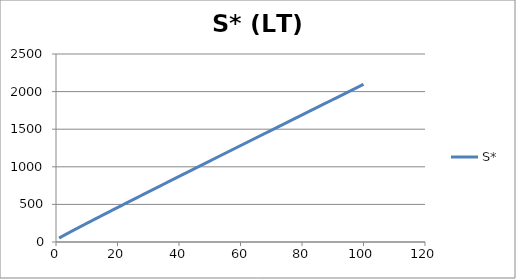
| Category | S* |
|---|---|
| 1.0 | 52.293 |
| 2.0 | 74.986 |
| 3.0 | 97.237 |
| 4.0 | 119.205 |
| 5.0 | 140.972 |
| 6.0 | 162.587 |
| 7.0 | 184.081 |
| 8.0 | 205.477 |
| 9.0 | 226.79 |
| 10.0 | 248.034 |
| 11.0 | 269.216 |
| 12.0 | 290.344 |
| 13.0 | 311.426 |
| 14.0 | 332.465 |
| 15.0 | 353.465 |
| 16.0 | 374.431 |
| 17.0 | 395.366 |
| 18.0 | 416.271 |
| 19.0 | 437.149 |
| 20.0 | 458.003 |
| 21.0 | 478.833 |
| 22.0 | 499.642 |
| 23.0 | 520.431 |
| 24.0 | 541.201 |
| 25.0 | 561.954 |
| 26.0 | 582.689 |
| 27.0 | 603.409 |
| 28.0 | 624.114 |
| 29.0 | 644.804 |
| 30.0 | 665.482 |
| 31.0 | 686.146 |
| 32.0 | 706.798 |
| 33.0 | 727.438 |
| 34.0 | 748.067 |
| 35.0 | 768.686 |
| 36.0 | 789.294 |
| 37.0 | 809.892 |
| 38.0 | 830.481 |
| 39.0 | 851.06 |
| 40.0 | 871.631 |
| 41.0 | 892.194 |
| 42.0 | 912.748 |
| 43.0 | 933.295 |
| 44.0 | 953.833 |
| 45.0 | 974.365 |
| 46.0 | 994.889 |
| 47.0 | 1015.407 |
| 48.0 | 1035.918 |
| 49.0 | 1056.422 |
| 50.0 | 1076.92 |
| 51.0 | 1097.412 |
| 52.0 | 1117.898 |
| 53.0 | 1138.379 |
| 54.0 | 1158.853 |
| 55.0 | 1179.323 |
| 56.0 | 1199.787 |
| 57.0 | 1220.246 |
| 58.0 | 1240.699 |
| 59.0 | 1261.148 |
| 60.0 | 1281.593 |
| 61.0 | 1302.032 |
| 62.0 | 1322.467 |
| 63.0 | 1342.898 |
| 64.0 | 1363.324 |
| 65.0 | 1383.746 |
| 66.0 | 1404.164 |
| 67.0 | 1424.578 |
| 68.0 | 1444.987 |
| 69.0 | 1465.393 |
| 70.0 | 1485.796 |
| 71.0 | 1506.194 |
| 72.0 | 1526.589 |
| 73.0 | 1546.98 |
| 74.0 | 1567.368 |
| 75.0 | 1587.752 |
| 76.0 | 1608.134 |
| 77.0 | 1628.511 |
| 78.0 | 1648.886 |
| 79.0 | 1669.257 |
| 80.0 | 1689.626 |
| 81.0 | 1709.991 |
| 82.0 | 1730.353 |
| 83.0 | 1750.712 |
| 84.0 | 1771.069 |
| 85.0 | 1791.423 |
| 86.0 | 1811.773 |
| 87.0 | 1832.122 |
| 88.0 | 1852.467 |
| 89.0 | 1872.81 |
| 90.0 | 1893.15 |
| 91.0 | 1913.488 |
| 92.0 | 1933.823 |
| 93.0 | 1954.155 |
| 94.0 | 1974.486 |
| 95.0 | 1994.813 |
| 96.0 | 2015.139 |
| 97.0 | 2035.462 |
| 98.0 | 2055.783 |
| 99.0 | 2076.102 |
| 100.0 | 2096.418 |